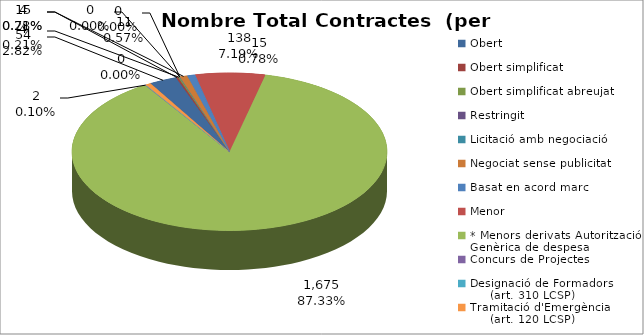
| Category | Nombre Total Contractes |
|---|---|
| Obert | 54 |
| Obert simplificat | 4 |
| Obert simplificat abreujat | 4 |
| Restringit | 0 |
| Licitació amb negociació | 0 |
| Negociat sense publicitat | 15 |
| Basat en acord marc | 15 |
| Menor | 138 |
| * Menors derivats Autorització Genèrica de despesa | 1675 |
| Concurs de Projectes | 2 |
| Designació de Formadors
     (art. 310 LCSP) | 0 |
| Tramitació d'Emergència
     (art. 120 LCSP) | 11 |